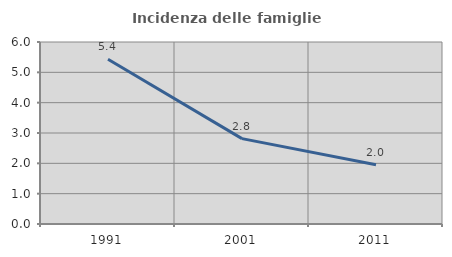
| Category | Incidenza delle famiglie numerose |
|---|---|
| 1991.0 | 5.43 |
| 2001.0 | 2.815 |
| 2011.0 | 1.953 |